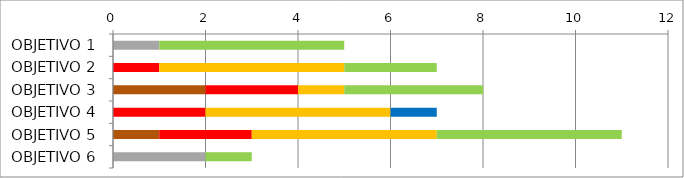
| Category | Series 0 | Series 1 | Series 2 | Series 3 | Series 4 | Series 5 |
|---|---|---|---|---|---|---|
| OBJETIVO 1 | 0 | 1 | 0 | 0 | 4 | 0 |
| OBJETIVO 2 | 0 | 0 | 1 | 4 | 2 | 0 |
| OBJETIVO 3 | 2 | 0 | 2 | 1 | 3 | 0 |
| OBJETIVO 4 | 0 | 0 | 2 | 4 | 0 | 1 |
| OBJETIVO 5 | 1 | 0 | 2 | 4 | 4 | 0 |
| OBJETIVO 6 | 0 | 2 | 0 | 0 | 1 | 0 |